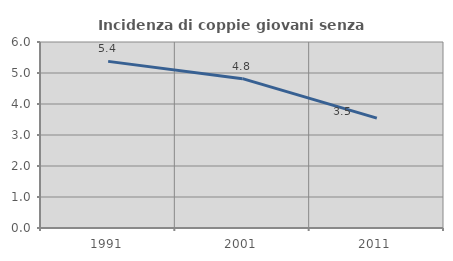
| Category | Incidenza di coppie giovani senza figli |
|---|---|
| 1991.0 | 5.375 |
| 2001.0 | 4.818 |
| 2011.0 | 3.545 |